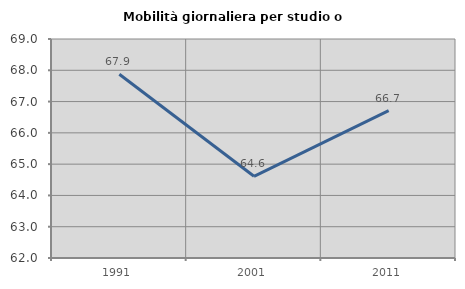
| Category | Mobilità giornaliera per studio o lavoro |
|---|---|
| 1991.0 | 67.875 |
| 2001.0 | 64.612 |
| 2011.0 | 66.712 |